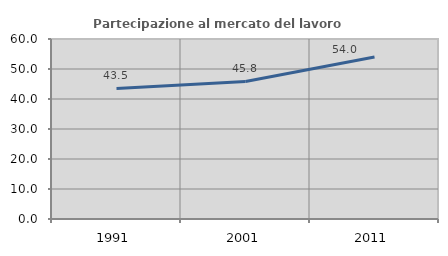
| Category | Partecipazione al mercato del lavoro  femminile |
|---|---|
| 1991.0 | 43.522 |
| 2001.0 | 45.845 |
| 2011.0 | 54.031 |